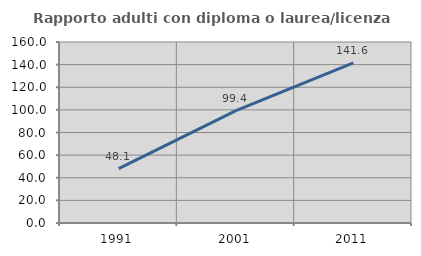
| Category | Rapporto adulti con diploma o laurea/licenza media  |
|---|---|
| 1991.0 | 48.148 |
| 2001.0 | 99.351 |
| 2011.0 | 141.606 |